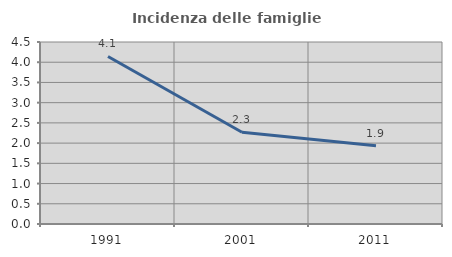
| Category | Incidenza delle famiglie numerose |
|---|---|
| 1991.0 | 4.143 |
| 2001.0 | 2.269 |
| 2011.0 | 1.934 |